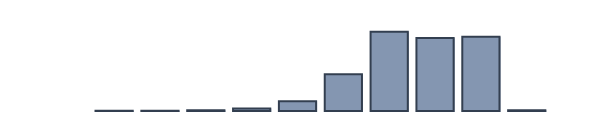
| Category | Series 0 |
|---|---|
| 0 | 0 |
| 1 | 0 |
| 2 | 0.087 |
| 3 | 0.13 |
| 4 | 0.261 |
| 5 | 0.913 |
| 6 | 3.478 |
| 7 | 13.217 |
| 8 | 28.522 |
| 9 | 26.348 |
| 10 | 26.783 |
| 11 | 0.261 |
| 12 | 0 |